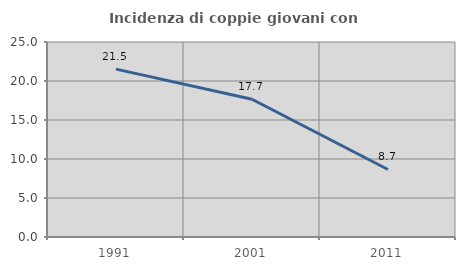
| Category | Incidenza di coppie giovani con figli |
|---|---|
| 1991.0 | 21.522 |
| 2001.0 | 17.663 |
| 2011.0 | 8.657 |